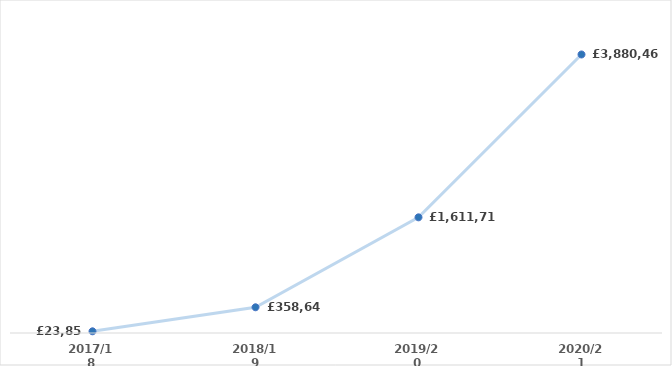
| Category | Dumfries & Galloway |
|---|---|
| 2017/18 | 23851.36 |
| 2018/19 | 358646.29 |
| 2019/20 | 1611719.33 |
| 2020/21 | 3880465.95 |